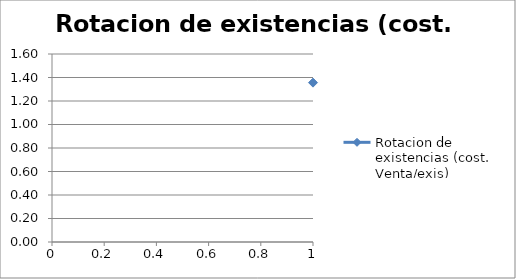
| Category | Rotacion de existencias (cost. Venta/exis) |
|---|---|
| 0 | 1.356 |
| 1 | 1.356 |
| 2 | 1.356 |
| 3 | 1.356 |
| 4 | 1.356 |
| 5 | 1.356 |
| 6 | 1.356 |
| 7 | 1.356 |